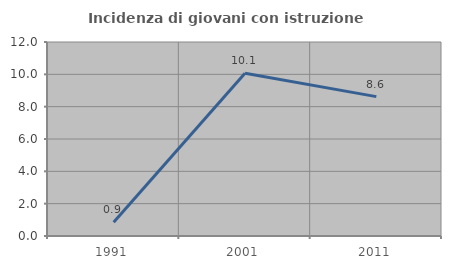
| Category | Incidenza di giovani con istruzione universitaria |
|---|---|
| 1991.0 | 0.855 |
| 2001.0 | 10.072 |
| 2011.0 | 8.621 |